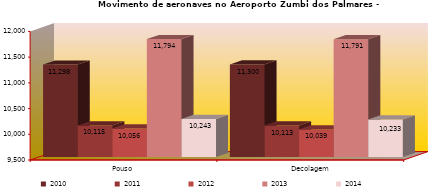
| Category | 2010 | 2011 | 2012 | 2013 | 2014 |
|---|---|---|---|---|---|
| Pouso  | 11298 | 10115 | 10056 | 11794 | 10243 |
| Decolagem | 11300 | 10113 | 10039 | 11791 | 10233 |